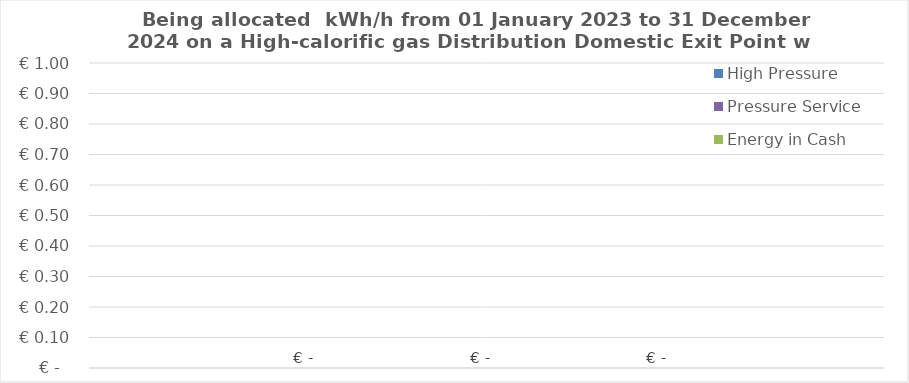
| Category | High Pressure | Pressure Service | Energy in Cash  |
|---|---|---|---|
|  | 0 | 0 | 0 |